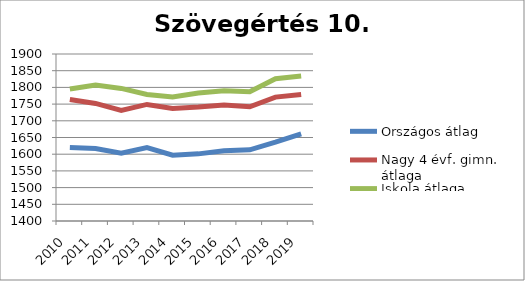
| Category | Országos átlag | Nagy 4 évf. gimn. átlaga | Iskola átlaga |
|---|---|---|---|
| 2010.0 | 1620 | 1764 | 1795 |
| 2011.0 | 1617 | 1752 | 1807 |
| 2012.0 | 1603 | 1731 | 1797 |
| 2013.0 | 1620 | 1749 | 1779 |
| 2014.0 | 1597 | 1737 | 1771 |
| 2015.0 | 1601 | 1741 | 1783 |
| 2016.0 | 1610 | 1747 | 1790 |
| 2017.0 | 1613 | 1742 | 1787 |
| 2018.0 | 1636 | 1771 | 1826 |
| 2019.0 | 1661 | 1779 | 1834 |